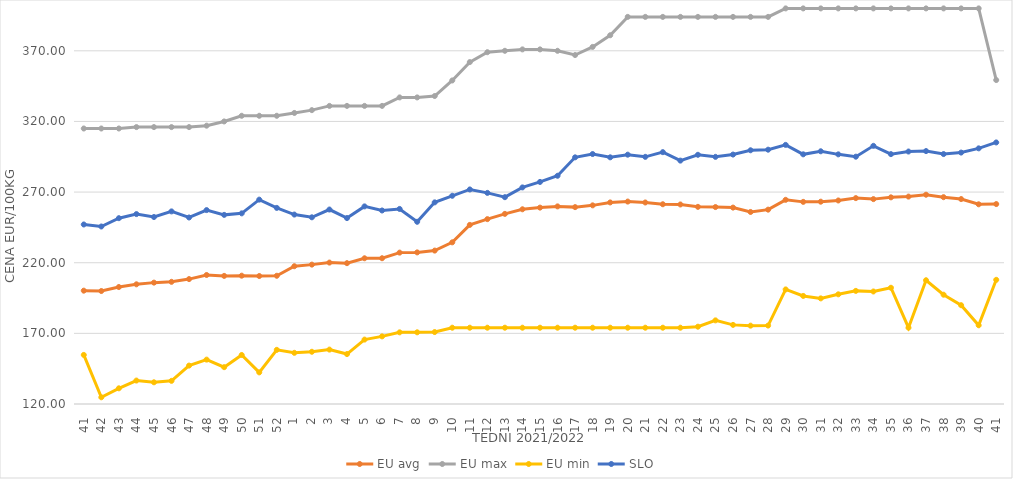
| Category | EU avg | EU max | EU min | SLO |
|---|---|---|---|---|
| 41.0 | 200.22 | 315 | 154.74 | 247.07 |
| 42.0 | 199.965 | 315 | 124.748 | 245.64 |
| 43.0 | 202.804 | 315 | 131.104 | 251.53 |
| 44.0 | 204.713 | 316 | 136.6 | 254.42 |
| 45.0 | 205.906 | 316 | 135.362 | 252.35 |
| 46.0 | 206.476 | 316 | 136.39 | 256.33 |
| 47.0 | 208.415 | 316 | 147.192 | 252.01 |
| 48.0 | 211.314 | 317 | 151.41 | 257.25 |
| 49.0 | 210.677 | 320 | 146.064 | 253.87 |
| 50.0 | 210.823 | 324 | 154.698 | 254.94 |
| 51.0 | 210.59 | 324 | 142.382 | 264.65 |
| 52.0 | 210.763 | 324 | 158.333 | 258.8 |
| 1.0 | 217.519 | 326 | 156.222 | 254.09 |
| 2.0 | 218.654 | 328 | 156.969 | 252.15 |
| 3.0 | 220.098 | 331 | 158.511 | 257.65 |
| 4.0 | 219.685 | 331 | 155.346 | 251.6 |
| 5.0 | 223.143 | 331 | 165.59 | 259.87 |
| 6.0 | 223.178 | 331 | 167.86 | 256.97 |
| 7.0 | 227.145 | 337 | 170.719 | 258.07 |
| 8.0 | 227.312 | 337 | 170.743 | 248.97 |
| 9.0 | 228.588 | 338 | 170.92 | 262.72 |
| 10.0 | 234.434 | 349 | 174 | 267.38 |
| 11.0 | 246.762 | 362 | 174 | 271.86 |
| 12.0 | 250.845 | 369 | 174 | 269.43 |
| 13.0 | 254.568 | 370 | 174 | 266.39 |
| 14.0 | 257.819 | 371 | 174 | 273.3 |
| 15.0 | 259 | 371 | 174 | 277.18 |
| 16.0 | 259.873 | 370 | 174 | 281.55 |
| 17.0 | 259.351 | 367 | 174 | 294.59 |
| 18.0 | 260.6 | 372.758 | 174 | 296.93 |
| 19.0 | 262.669 | 381 | 174 | 294.6 |
| 20.0 | 263.291 | 394 | 174 | 296.48 |
| 21.0 | 262.64 | 394 | 174 | 294.94 |
| 22.0 | 261.388 | 394 | 174 | 298.26 |
| 23.0 | 261.228 | 394 | 174 | 292.27 |
| 24.0 | 259.544 | 394 | 174.72 | 296.39 |
| 25.0 | 259.395 | 394 | 179.2 | 294.93 |
| 26.0 | 259.018 | 394 | 176 | 296.56 |
| 27.0 | 255.922 | 394 | 175.451 | 299.59 |
| 28.0 | 257.564 | 394 | 175.52 | 300.01 |
| 29.0 | 264.52 | 400 | 201.097 | 303.41 |
| 30.0 | 263.067 | 400 | 196.496 | 296.73 |
| 31.0 | 263.196 | 400 | 194.756 | 298.88 |
| 32.0 | 264.059 | 400 | 197.634 | 296.7 |
| 33.0 | 265.729 | 400 | 200.07 | 295.05 |
| 34.0 | 265.016 | 400 | 199.637 | 302.73 |
| 35.0 | 266.273 | 400 | 202.277 | 296.86 |
| 36.0 | 266.807 | 400 | 174 | 298.7 |
| 37.0 | 268.136 | 400 | 207.594 | 299.02 |
| 38.0 | 266.39 | 400 | 197.352 | 296.91 |
| 39.0 | 265.059 | 400 | 189.926 | 297.96 |
| 40.0 | 261.35 | 400 | 175.723 | 300.95 |
| 41.0 | 261.517 | 349.29 | 207.892 | 305.13 |